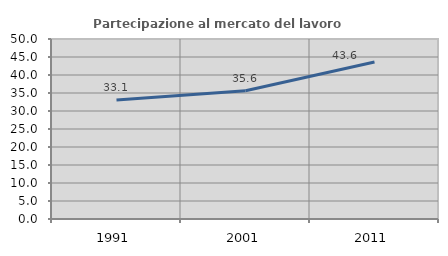
| Category | Partecipazione al mercato del lavoro  femminile |
|---|---|
| 1991.0 | 33.088 |
| 2001.0 | 35.647 |
| 2011.0 | 43.594 |